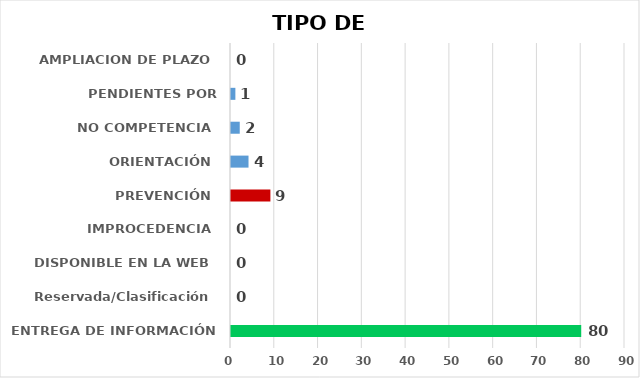
| Category | CANTIDAD DE RESPUESTAS |
|---|---|
| ENTREGA DE INFORMACIÓN | 80 |
| Reservada/Clasificación | 0 |
| DISPONIBLE EN LA WEB | 0 |
| IMPROCEDENCIA | 0 |
| PREVENCIÓN | 9 |
| ORIENTACIÓN | 4 |
| NO COMPETENCIA | 2 |
| PENDIENTES POR CONTESTAR | 1 |
| AMPLIACION DE PLAZO | 0 |